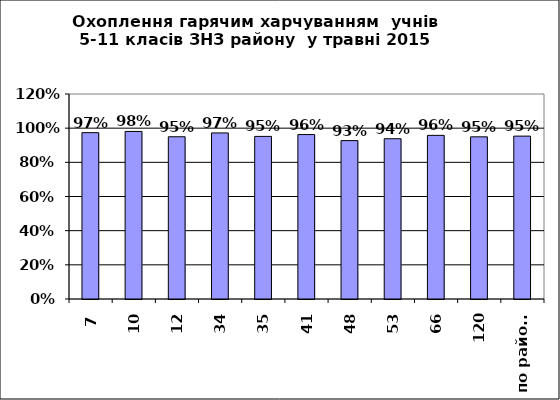
| Category | Series 0 |
|---|---|
| 7 | 0.974 |
| 10 | 0.981 |
| 12 | 0.95 |
| 34 | 0.972 |
| 35 | 0.952 |
| 41 | 0.963 |
| 48 | 0.927 |
| 53 | 0.938 |
| 66 | 0.958 |
| 120 | 0.949 |
| по району | 0.953 |